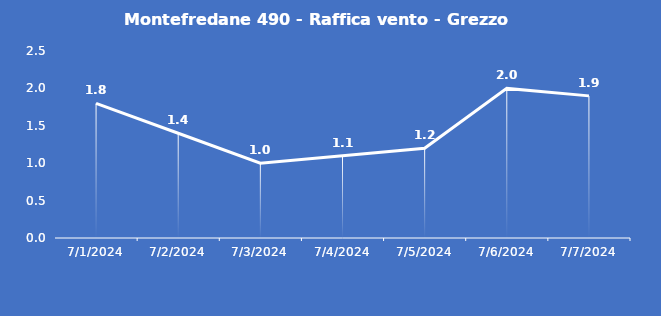
| Category | Montefredane 490 - Raffica vento - Grezzo (m/s) |
|---|---|
| 7/1/24 | 1.8 |
| 7/2/24 | 1.4 |
| 7/3/24 | 1 |
| 7/4/24 | 1.1 |
| 7/5/24 | 1.2 |
| 7/6/24 | 2 |
| 7/7/24 | 1.9 |